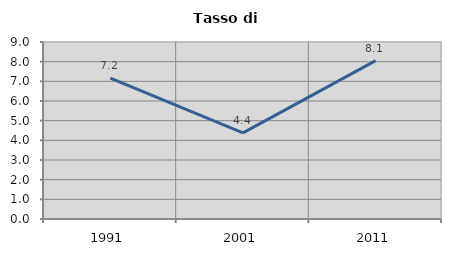
| Category | Tasso di disoccupazione   |
|---|---|
| 1991.0 | 7.159 |
| 2001.0 | 4.38 |
| 2011.0 | 8.051 |